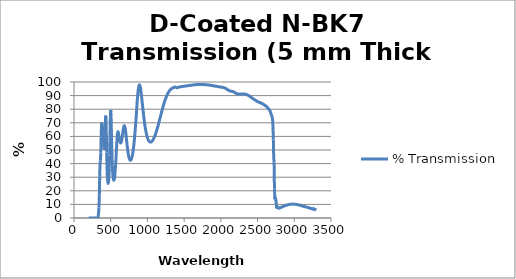
| Category | % Transmission |
|---|---|
| 200.0 | 0 |
| 205.0 | 0.004 |
| 210.0 | 0.003 |
| 215.0 | 0 |
| 220.0 | 0.001 |
| 225.0 | 0.004 |
| 230.0 | 0.003 |
| 235.0 | 0.002 |
| 240.0 | 0.002 |
| 245.0 | 0.005 |
| 250.0 | 0.003 |
| 255.0 | 0 |
| 260.0 | 0.002 |
| 265.0 | 0.003 |
| 270.0 | 0.003 |
| 275.0 | 0.002 |
| 280.0 | 0.003 |
| 285.0 | 0.005 |
| 290.0 | 0.002 |
| 295.0 | 0 |
| 300.0 | 0.003 |
| 305.0 | 0.005 |
| 310.0 | 0.001 |
| 315.0 | 0.009 |
| 320.0 | 0.066 |
| 325.0 | 0.358 |
| 330.0 | 1.503 |
| 335.0 | 3.976 |
| 340.0 | 7.852 |
| 345.0 | 16.272 |
| 350.0 | 30.653 |
| 355.0 | 40.576 |
| 360.0 | 42.168 |
| 365.0 | 48.305 |
| 370.0 | 60.045 |
| 375.0 | 69.232 |
| 380.0 | 70.204 |
| 385.0 | 67.848 |
| 390.0 | 66.576 |
| 395.0 | 64.684 |
| 400.0 | 60.018 |
| 405.0 | 54.113 |
| 410.0 | 50.281 |
| 415.0 | 50.514 |
| 420.0 | 55.686 |
| 425.0 | 65.345 |
| 430.0 | 74.923 |
| 435.0 | 75.358 |
| 440.0 | 63.67 |
| 445.0 | 48.388 |
| 450.0 | 36.832 |
| 455.0 | 29.923 |
| 460.0 | 26.418 |
| 465.0 | 25.418 |
| 470.0 | 26.556 |
| 475.0 | 29.949 |
| 480.0 | 36.125 |
| 485.0 | 45.887 |
| 490.0 | 59.264 |
| 495.0 | 72.874 |
| 500.0 | 79.503 |
| 505.0 | 74.665 |
| 510.0 | 62.719 |
| 515.0 | 50.613 |
| 520.0 | 41.321 |
| 525.0 | 35.045 |
| 530.0 | 31.081 |
| 535.0 | 28.841 |
| 540.0 | 27.878 |
| 545.0 | 27.98 |
| 550.0 | 29.027 |
| 555.0 | 30.995 |
| 560.0 | 33.879 |
| 565.0 | 37.611 |
| 570.0 | 42.142 |
| 575.0 | 47.238 |
| 580.0 | 52.48 |
| 585.0 | 57.23 |
| 590.0 | 60.849 |
| 595.0 | 62.903 |
| 600.0 | 63.385 |
| 605.0 | 62.605 |
| 610.0 | 61.056 |
| 615.0 | 59.241 |
| 620.0 | 57.598 |
| 625.0 | 56.295 |
| 630.0 | 55.454 |
| 635.0 | 55.149 |
| 640.0 | 55.434 |
| 645.0 | 56.212 |
| 650.0 | 57.441 |
| 655.0 | 59.024 |
| 660.0 | 60.911 |
| 665.0 | 62.89 |
| 670.0 | 64.738 |
| 675.0 | 66.297 |
| 680.0 | 67.434 |
| 685.0 | 67.89 |
| 690.0 | 67.605 |
| 695.0 | 66.604 |
| 700.0 | 64.955 |
| 705.0 | 62.824 |
| 710.0 | 60.374 |
| 715.0 | 57.815 |
| 720.0 | 55.247 |
| 725.0 | 52.812 |
| 730.0 | 50.558 |
| 735.0 | 48.562 |
| 740.0 | 46.842 |
| 745.0 | 45.421 |
| 750.0 | 44.269 |
| 755.0 | 43.413 |
| 760.0 | 42.837 |
| 765.0 | 42.513 |
| 770.0 | 42.452 |
| 775.0 | 42.664 |
| 780.0 | 43.131 |
| 785.0 | 43.853 |
| 790.0 | 44.822 |
| 795.0 | 46.059 |
| 800.0 | 47.566 |
| 805.0 | 49.338 |
| 810.0 | 51.396 |
| 815.0 | 53.734 |
| 820.0 | 56.332 |
| 825.0 | 59.199 |
| 830.0 | 62.366 |
| 835.0 | 65.757 |
| 840.0 | 69.332 |
| 845.0 | 73.044 |
| 850.0 | 76.866 |
| 855.0 | 80.977 |
| 860.0 | 85.209 |
| 865.0 | 88.583 |
| 870.0 | 91.652 |
| 875.0 | 94.18 |
| 880.0 | 96.07 |
| 885.0 | 97.3 |
| 890.0 | 97.838 |
| 895.0 | 97.716 |
| 900.0 | 96.976 |
| 905.0 | 95.707 |
| 910.0 | 93.953 |
| 915.0 | 91.831 |
| 920.0 | 89.458 |
| 925.0 | 86.929 |
| 930.0 | 84.354 |
| 935.0 | 81.822 |
| 940.0 | 79.331 |
| 945.0 | 76.879 |
| 950.0 | 74.496 |
| 955.0 | 72.237 |
| 960.0 | 70.163 |
| 965.0 | 68.247 |
| 970.0 | 66.497 |
| 975.0 | 64.933 |
| 980.0 | 63.512 |
| 985.0 | 62.215 |
| 990.0 | 61.06 |
| 995.0 | 60.018 |
| 1000.0 | 59.11 |
| 1005.0 | 58.344 |
| 1010.0 | 57.656 |
| 1015.0 | 57.101 |
| 1020.0 | 56.684 |
| 1025.0 | 56.343 |
| 1030.0 | 56.09 |
| 1035.0 | 55.913 |
| 1040.0 | 55.817 |
| 1045.0 | 55.818 |
| 1050.0 | 55.89 |
| 1055.0 | 56.015 |
| 1060.0 | 56.248 |
| 1065.0 | 56.561 |
| 1070.0 | 56.89 |
| 1075.0 | 57.299 |
| 1080.0 | 57.796 |
| 1085.0 | 58.34 |
| 1090.0 | 58.912 |
| 1095.0 | 59.509 |
| 1100.0 | 60.165 |
| 1105.0 | 60.888 |
| 1110.0 | 61.654 |
| 1115.0 | 62.47 |
| 1120.0 | 63.323 |
| 1125.0 | 64.178 |
| 1130.0 | 65.064 |
| 1135.0 | 65.99 |
| 1140.0 | 66.948 |
| 1145.0 | 67.949 |
| 1150.0 | 68.964 |
| 1155.0 | 69.979 |
| 1160.0 | 70.995 |
| 1165.0 | 72.052 |
| 1170.0 | 73.101 |
| 1175.0 | 74.119 |
| 1180.0 | 75.132 |
| 1185.0 | 76.19 |
| 1190.0 | 77.264 |
| 1195.0 | 78.29 |
| 1200.0 | 79.318 |
| 1205.0 | 80.322 |
| 1210.0 | 81.281 |
| 1215.0 | 82.206 |
| 1220.0 | 83.122 |
| 1225.0 | 84.011 |
| 1230.0 | 84.899 |
| 1235.0 | 85.78 |
| 1240.0 | 86.601 |
| 1245.0 | 87.344 |
| 1250.0 | 88.071 |
| 1255.0 | 88.762 |
| 1260.0 | 89.409 |
| 1265.0 | 90.035 |
| 1270.0 | 90.656 |
| 1275.0 | 91.22 |
| 1280.0 | 91.751 |
| 1285.0 | 92.243 |
| 1290.0 | 92.663 |
| 1295.0 | 93.06 |
| 1300.0 | 93.471 |
| 1305.0 | 93.827 |
| 1310.0 | 94.142 |
| 1315.0 | 94.447 |
| 1320.0 | 94.731 |
| 1325.0 | 94.984 |
| 1330.0 | 95.198 |
| 1335.0 | 95.38 |
| 1340.0 | 95.526 |
| 1345.0 | 95.683 |
| 1350.0 | 95.771 |
| 1355.0 | 95.893 |
| 1360.0 | 96.021 |
| 1365.0 | 96.102 |
| 1370.0 | 96.195 |
| 1375.0 | 96.281 |
| 1380.0 | 96.294 |
| 1385.0 | 96.222 |
| 1390.0 | 96.095 |
| 1395.0 | 95.911 |
| 1400.0 | 95.806 |
| 1405.0 | 95.743 |
| 1410.0 | 95.781 |
| 1415.0 | 95.903 |
| 1420.0 | 96.058 |
| 1425.0 | 96.172 |
| 1430.0 | 96.267 |
| 1435.0 | 96.357 |
| 1440.0 | 96.434 |
| 1445.0 | 96.481 |
| 1450.0 | 96.54 |
| 1455.0 | 96.563 |
| 1460.0 | 96.613 |
| 1465.0 | 96.663 |
| 1470.0 | 96.685 |
| 1475.0 | 96.702 |
| 1480.0 | 96.71 |
| 1485.0 | 96.767 |
| 1490.0 | 96.829 |
| 1495.0 | 96.822 |
| 1500.0 | 96.85 |
| 1505.0 | 96.908 |
| 1510.0 | 96.966 |
| 1515.0 | 96.987 |
| 1520.0 | 96.988 |
| 1525.0 | 97.034 |
| 1530.0 | 97.078 |
| 1535.0 | 97.135 |
| 1540.0 | 97.184 |
| 1545.0 | 97.202 |
| 1550.0 | 97.249 |
| 1555.0 | 97.32 |
| 1560.0 | 97.34 |
| 1565.0 | 97.353 |
| 1570.0 | 97.406 |
| 1575.0 | 97.451 |
| 1580.0 | 97.48 |
| 1585.0 | 97.529 |
| 1590.0 | 97.551 |
| 1595.0 | 97.578 |
| 1600.0 | 97.634 |
| 1605.0 | 97.694 |
| 1610.0 | 97.73 |
| 1615.0 | 97.752 |
| 1620.0 | 97.803 |
| 1625.0 | 97.839 |
| 1630.0 | 97.87 |
| 1635.0 | 97.896 |
| 1640.0 | 97.945 |
| 1645.0 | 97.969 |
| 1650.0 | 97.988 |
| 1655.0 | 97.998 |
| 1660.0 | 98.047 |
| 1665.0 | 98.081 |
| 1670.0 | 98.098 |
| 1675.0 | 98.118 |
| 1680.0 | 98.12 |
| 1685.0 | 98.164 |
| 1690.0 | 98.172 |
| 1695.0 | 98.174 |
| 1700.0 | 98.181 |
| 1705.0 | 98.207 |
| 1710.0 | 98.22 |
| 1715.0 | 98.187 |
| 1720.0 | 98.224 |
| 1725.0 | 98.221 |
| 1730.0 | 98.237 |
| 1735.0 | 98.207 |
| 1740.0 | 98.205 |
| 1745.0 | 98.226 |
| 1750.0 | 98.217 |
| 1755.0 | 98.197 |
| 1760.0 | 98.175 |
| 1765.0 | 98.148 |
| 1770.0 | 98.163 |
| 1775.0 | 98.124 |
| 1780.0 | 98.075 |
| 1785.0 | 98.056 |
| 1790.0 | 98.046 |
| 1795.0 | 98.029 |
| 1800.0 | 97.992 |
| 1805.0 | 97.959 |
| 1810.0 | 97.944 |
| 1815.0 | 97.922 |
| 1820.0 | 97.886 |
| 1825.0 | 97.854 |
| 1830.0 | 97.815 |
| 1835.0 | 97.824 |
| 1840.0 | 97.77 |
| 1845.0 | 97.696 |
| 1850.0 | 97.644 |
| 1855.0 | 97.631 |
| 1860.0 | 97.558 |
| 1865.0 | 97.541 |
| 1870.0 | 97.498 |
| 1875.0 | 97.432 |
| 1880.0 | 97.375 |
| 1885.0 | 97.37 |
| 1890.0 | 97.305 |
| 1895.0 | 97.272 |
| 1900.0 | 97.207 |
| 1905.0 | 97.132 |
| 1910.0 | 97.046 |
| 1915.0 | 97.053 |
| 1920.0 | 97.039 |
| 1925.0 | 96.995 |
| 1930.0 | 96.92 |
| 1935.0 | 96.89 |
| 1940.0 | 96.854 |
| 1945.0 | 96.795 |
| 1950.0 | 96.764 |
| 1955.0 | 96.697 |
| 1960.0 | 96.673 |
| 1965.0 | 96.611 |
| 1970.0 | 96.54 |
| 1975.0 | 96.458 |
| 1980.0 | 96.411 |
| 1985.0 | 96.404 |
| 1990.0 | 96.338 |
| 1995.0 | 96.304 |
| 2000.0 | 96.26 |
| 2005.0 | 96.26 |
| 2010.0 | 96.199 |
| 2015.0 | 96.146 |
| 2020.0 | 96.095 |
| 2025.0 | 96.053 |
| 2030.0 | 95.974 |
| 2035.0 | 95.905 |
| 2040.0 | 95.829 |
| 2045.0 | 95.74 |
| 2050.0 | 95.649 |
| 2055.0 | 95.547 |
| 2060.0 | 95.424 |
| 2065.0 | 95.29 |
| 2070.0 | 95.124 |
| 2075.0 | 94.941 |
| 2080.0 | 94.773 |
| 2085.0 | 94.605 |
| 2090.0 | 94.42 |
| 2095.0 | 94.232 |
| 2100.0 | 94.076 |
| 2105.0 | 93.899 |
| 2110.0 | 93.723 |
| 2115.0 | 93.553 |
| 2120.0 | 93.427 |
| 2125.0 | 93.331 |
| 2130.0 | 93.28 |
| 2135.0 | 93.265 |
| 2140.0 | 93.244 |
| 2145.0 | 93.2 |
| 2150.0 | 93.141 |
| 2155.0 | 93.081 |
| 2160.0 | 93.025 |
| 2165.0 | 92.965 |
| 2170.0 | 92.868 |
| 2175.0 | 92.724 |
| 2180.0 | 92.575 |
| 2185.0 | 92.418 |
| 2190.0 | 92.249 |
| 2195.0 | 92.058 |
| 2200.0 | 91.864 |
| 2205.0 | 91.697 |
| 2210.0 | 91.552 |
| 2215.0 | 91.416 |
| 2220.0 | 91.312 |
| 2225.0 | 91.219 |
| 2230.0 | 91.144 |
| 2235.0 | 91.09 |
| 2240.0 | 91.104 |
| 2245.0 | 91.089 |
| 2250.0 | 91.069 |
| 2255.0 | 91.091 |
| 2260.0 | 91.121 |
| 2265.0 | 91.155 |
| 2270.0 | 91.159 |
| 2275.0 | 91.177 |
| 2280.0 | 91.22 |
| 2285.0 | 91.219 |
| 2290.0 | 91.242 |
| 2295.0 | 91.263 |
| 2300.0 | 91.238 |
| 2305.0 | 91.25 |
| 2310.0 | 91.243 |
| 2315.0 | 91.204 |
| 2320.0 | 91.152 |
| 2325.0 | 91.118 |
| 2330.0 | 91.095 |
| 2335.0 | 91.056 |
| 2340.0 | 91.004 |
| 2345.0 | 90.917 |
| 2350.0 | 90.795 |
| 2355.0 | 90.673 |
| 2360.0 | 90.552 |
| 2365.0 | 90.446 |
| 2370.0 | 90.304 |
| 2375.0 | 90.14 |
| 2380.0 | 89.942 |
| 2385.0 | 89.755 |
| 2390.0 | 89.589 |
| 2395.0 | 89.38 |
| 2400.0 | 89.159 |
| 2405.0 | 88.956 |
| 2410.0 | 88.773 |
| 2415.0 | 88.592 |
| 2420.0 | 88.398 |
| 2425.0 | 88.223 |
| 2430.0 | 88.058 |
| 2435.0 | 87.869 |
| 2440.0 | 87.673 |
| 2445.0 | 87.508 |
| 2450.0 | 87.36 |
| 2455.0 | 87.178 |
| 2460.0 | 86.972 |
| 2465.0 | 86.779 |
| 2470.0 | 86.595 |
| 2475.0 | 86.409 |
| 2480.0 | 86.217 |
| 2485.0 | 86.039 |
| 2490.0 | 85.892 |
| 2495.0 | 85.753 |
| 2500.0 | 85.62 |
| 2505.0 | 85.485 |
| 2510.0 | 85.342 |
| 2515.0 | 85.213 |
| 2520.0 | 85.112 |
| 2525.0 | 84.998 |
| 2530.0 | 84.901 |
| 2535.0 | 84.787 |
| 2540.0 | 84.669 |
| 2545.0 | 84.588 |
| 2550.0 | 84.466 |
| 2555.0 | 84.307 |
| 2560.0 | 84.185 |
| 2565.0 | 84.064 |
| 2570.0 | 83.897 |
| 2575.0 | 83.718 |
| 2580.0 | 83.575 |
| 2585.0 | 83.422 |
| 2590.0 | 83.243 |
| 2595.0 | 83.041 |
| 2600.0 | 82.857 |
| 2605.0 | 82.679 |
| 2610.0 | 82.481 |
| 2615.0 | 82.26 |
| 2620.0 | 82.033 |
| 2625.0 | 81.778 |
| 2630.0 | 81.489 |
| 2635.0 | 81.163 |
| 2640.0 | 80.806 |
| 2645.0 | 80.504 |
| 2650.0 | 80.192 |
| 2655.0 | 79.825 |
| 2660.0 | 79.483 |
| 2665.0 | 79.166 |
| 2670.0 | 78.751 |
| 2675.0 | 77.892 |
| 2680.0 | 77.001 |
| 2685.0 | 76.265 |
| 2690.0 | 75.632 |
| 2695.0 | 74.977 |
| 2700.0 | 73.966 |
| 2705.0 | 71.708 |
| 2710.0 | 66.986 |
| 2715.0 | 57.571 |
| 2720.0 | 44.125 |
| 2725.0 | 41.017 |
| 2730.0 | 21.897 |
| 2735.0 | 13.881 |
| 2740.0 | 15.349 |
| 2745.0 | 14.27 |
| 2750.0 | 12.739 |
| 2755.0 | 10.472 |
| 2760.0 | 7.084 |
| 2765.0 | 8.307 |
| 2770.0 | 8.404 |
| 2775.0 | 7.46 |
| 2780.0 | 7.575 |
| 2785.0 | 7.574 |
| 2790.0 | 7.194 |
| 2795.0 | 7.276 |
| 2800.0 | 7.485 |
| 2805.0 | 7.503 |
| 2810.0 | 7.68 |
| 2815.0 | 7.702 |
| 2820.0 | 7.763 |
| 2825.0 | 7.898 |
| 2830.0 | 8.047 |
| 2835.0 | 8.16 |
| 2840.0 | 8.292 |
| 2845.0 | 8.39 |
| 2850.0 | 8.501 |
| 2855.0 | 8.636 |
| 2860.0 | 8.742 |
| 2865.0 | 8.838 |
| 2870.0 | 8.95 |
| 2875.0 | 9.057 |
| 2880.0 | 9.157 |
| 2885.0 | 9.238 |
| 2890.0 | 9.325 |
| 2895.0 | 9.392 |
| 2900.0 | 9.487 |
| 2905.0 | 9.576 |
| 2910.0 | 9.645 |
| 2915.0 | 9.72 |
| 2920.0 | 9.802 |
| 2925.0 | 9.845 |
| 2930.0 | 9.901 |
| 2935.0 | 9.954 |
| 2940.0 | 9.998 |
| 2945.0 | 10.052 |
| 2950.0 | 10.091 |
| 2955.0 | 10.104 |
| 2960.0 | 10.157 |
| 2965.0 | 10.149 |
| 2970.0 | 10.186 |
| 2975.0 | 10.216 |
| 2980.0 | 10.211 |
| 2985.0 | 10.191 |
| 2990.0 | 10.199 |
| 2995.0 | 10.196 |
| 3000.0 | 10.147 |
| 3005.0 | 10.148 |
| 3010.0 | 10.106 |
| 3015.0 | 10.079 |
| 3020.0 | 10.017 |
| 3025.0 | 10.023 |
| 3030.0 | 9.946 |
| 3035.0 | 9.898 |
| 3040.0 | 9.854 |
| 3045.0 | 9.796 |
| 3050.0 | 9.71 |
| 3055.0 | 9.628 |
| 3060.0 | 9.585 |
| 3065.0 | 9.496 |
| 3070.0 | 9.468 |
| 3075.0 | 9.367 |
| 3080.0 | 9.312 |
| 3085.0 | 9.213 |
| 3090.0 | 9.181 |
| 3095.0 | 9.081 |
| 3100.0 | 8.998 |
| 3105.0 | 8.914 |
| 3110.0 | 8.884 |
| 3115.0 | 8.766 |
| 3120.0 | 8.641 |
| 3125.0 | 8.547 |
| 3130.0 | 8.544 |
| 3135.0 | 8.499 |
| 3140.0 | 8.421 |
| 3145.0 | 8.387 |
| 3150.0 | 8.275 |
| 3155.0 | 8.222 |
| 3160.0 | 8.104 |
| 3165.0 | 8.011 |
| 3170.0 | 7.968 |
| 3175.0 | 7.866 |
| 3180.0 | 7.756 |
| 3185.0 | 7.785 |
| 3190.0 | 7.607 |
| 3195.0 | 7.551 |
| 3200.0 | 7.528 |
| 3205.0 | 7.461 |
| 3210.0 | 7.336 |
| 3215.0 | 7.12 |
| 3220.0 | 7.085 |
| 3225.0 | 7.023 |
| 3230.0 | 6.93 |
| 3235.0 | 7.081 |
| 3240.0 | 6.742 |
| 3245.0 | 6.866 |
| 3250.0 | 6.658 |
| 3255.0 | 6.508 |
| 3260.0 | 6.737 |
| 3265.0 | 6.905 |
| 3270.0 | 6.335 |
| 3275.0 | 6.356 |
| 3280.0 | 6.136 |
| 3285.0 | 6.077 |
| 3290.0 | 6.1 |
| 3295.0 | 6.073 |
| 3300.0 | 5.885 |